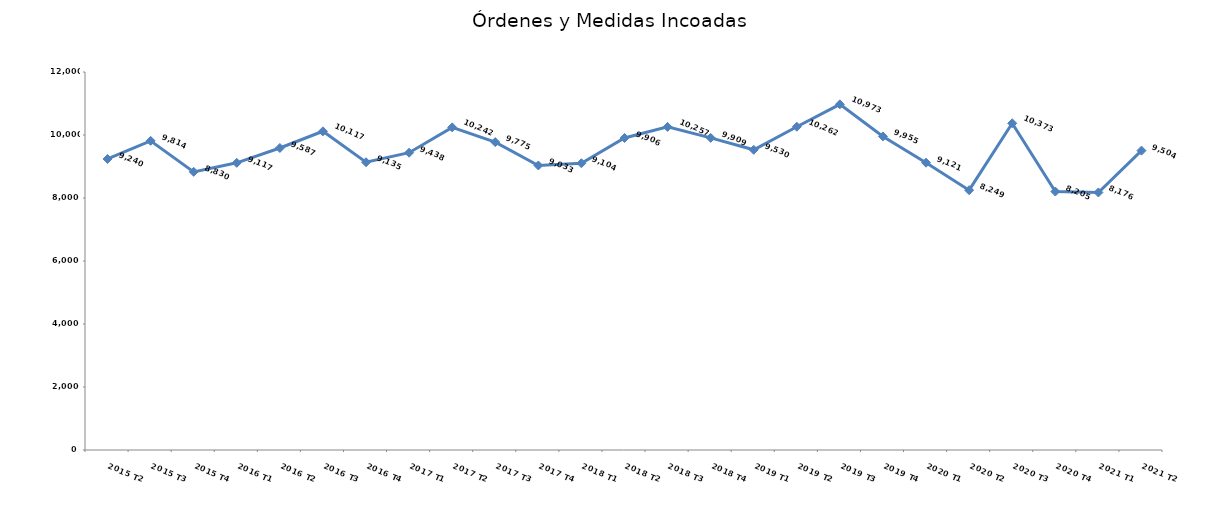
| Category | Órdenes y Medidas incoadas |
|---|---|
| 2015 T2 | 9240 |
| 2015 T3 | 9814 |
| 2015 T4 | 8830 |
| 2016 T1 | 9117 |
| 2016 T2 | 9587 |
| 2016 T3 | 10117 |
| 2016 T4 | 9135 |
| 2017 T1 | 9438 |
| 2017 T2 | 10242 |
| 2017 T3 | 9775 |
| 2017 T4 | 9033 |
| 2018 T1 | 9104 |
| 2018 T2 | 9906 |
| 2018 T3 | 10257 |
| 2018 T4 | 9909 |
| 2019 T1 | 9530 |
| 2019 T2 | 10262 |
| 2019 T3 | 10973 |
| 2019 T4 | 9955 |
| 2020 T1 | 9121 |
| 2020 T2 | 8249 |
| 2020 T3 | 10373 |
| 2020 T4 | 8205 |
| 2021 T1 | 8176 |
| 2021 T2 | 9504 |